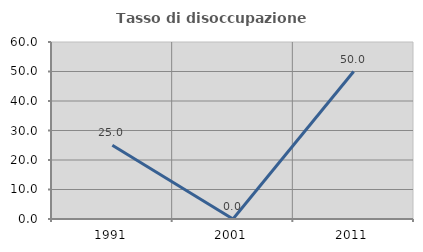
| Category | Tasso di disoccupazione giovanile  |
|---|---|
| 1991.0 | 25 |
| 2001.0 | 0 |
| 2011.0 | 50 |